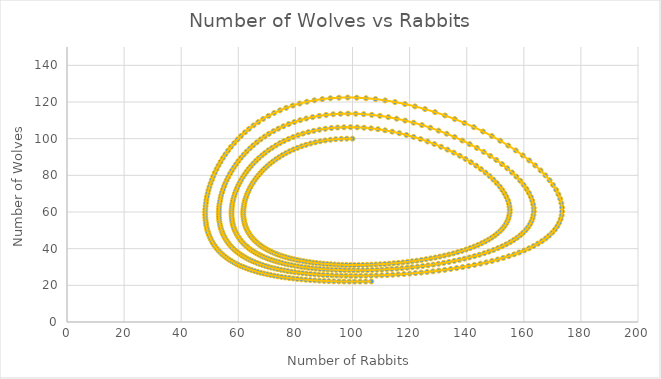
| Category | Wolves |
|---|---|
| 100.0 | 100 |
| 98.0 | 100 |
| 96.04 | 99.9 |
| 94.124002 | 99.702 |
| 92.2555371180218 | 99.409 |
| 90.43767529206256 | 99.024 |
| 88.6730401181214 | 98.551 |
| 86.96382799231598 | 97.993 |
| 85.31183072478386 | 97.354 |
| 83.71846081813496 | 96.639 |
| 82.18477864886654 | 95.852 |
| 80.71152085142708 | 94.999 |
| 79.29912927674037 | 94.082 |
| 77.94777997557912 | 93.109 |
| 76.6574117383475 | 92.082 |
| 75.42775380335446 | 91.007 |
| 74.25835242295386 | 89.889 |
| 73.14859604904728 | 88.732 |
| 72.09773896505367 | 87.541 |
| 71.10492324972356 | 86.32 |
| 70.16919900875263 | 85.072 |
| 69.28954285302093 | 83.804 |
| 68.46487463772834 | 82.517 |
| 67.69407250518984 | 81.216 |
| 66.9759862962117 | 79.904 |
| 66.30944941148343 | 78.584 |
| 65.69328921601422 | 77.261 |
| 65.12633608703902 | 75.935 |
| 64.60743120970594 | 74.611 |
| 64.13543322587716 | 73.291 |
| 63.70922384011011 | 71.977 |
| 63.3277124838488 | 70.671 |
| 62.98984013449807 | 69.375 |
| 62.69458238075251 | 68.091 |
| 62.44095181963131 | 66.821 |
| 62.22799986438927 | 65.566 |
| 62.05481803604445 | 64.328 |
| 61.9205388048498 | 63.107 |
| 61.8243360417674 | 61.906 |
| 61.76542513397156 | 60.724 |
| 61.74306281267944 | 59.563 |
| 61.75654673622716 | 58.424 |
| 61.80521486630229 | 57.307 |
| 61.88844467062012 | 56.212 |
| 62.0056521810929 | 55.141 |
| 62.15629093267786 | 54.094 |
| 62.33985080458868 | 53.07 |
| 62.55585678239594 | 52.071 |
| 62.80386765670432 | 51.096 |
| 63.08347467155351 | 50.146 |
| 63.39430013342384 | 49.22 |
| 63.73599598971024 | 48.319 |
| 64.10824238373843 | 47.443 |
| 64.51074619181045 | 46.592 |
| 64.94323954636342 | 45.765 |
| 65.40547834808412 | 44.963 |
| 65.89724076872545 | 44.185 |
| 66.4183257454012 | 43.432 |
| 66.9685514662768 | 42.702 |
| 67.54775384681308 | 41.997 |
| 68.15578499504309 | 41.316 |
| 68.7925116637582 | 40.658 |
| 69.4578136869378 | 40.023 |
| 70.1515823972693 | 39.412 |
| 70.87371902116098 | 38.824 |
| 71.62413304724657 | 38.259 |
| 72.40274056400516 | 37.716 |
| 73.20946256177461 | 37.195 |
| 74.0442231941108 | 36.697 |
| 74.90694799313776 | 36.221 |
| 75.79756203324195 | 35.766 |
| 76.7159880371844 | 35.334 |
| 77.66214441843528 | 34.922 |
| 78.6359432532773 | 34.532 |
| 79.63728817597475 | 34.163 |
| 80.66607219006521 | 33.815 |
| 81.72217538860397 | 33.489 |
| 82.80546257597396 | 33.182 |
| 83.91578078367554 | 32.897 |
| 85.05295667232957 | 32.633 |
| 86.2167938119701 | 32.389 |
| 87.4070698325772 | 32.166 |
| 88.62353343670897 | 31.963 |
| 89.86590126604781 | 31.781 |
| 91.13385461368554 | 31.62 |
| 92.42703597404842 | 31.48 |
| 93.74504542252095 | 31.361 |
| 95.08743681707946 | 31.263 |
| 96.45371381461489 | 31.186 |
| 97.84332569512561 | 31.131 |
| 99.25566298762375 | 31.097 |
| 100.6900528924441 | 31.085 |
| 102.1457544957102 | 31.096 |
| 103.6219537730256 | 31.13 |
| 105.1177583810623 | 31.186 |
| 106.6321922376559 | 31.266 |
| 108.1641898933323 | 31.369 |
| 109.7125906999401 | 31.497 |
| 111.2761327853017 | 31.65 |
| 112.8534468465857 | 31.829 |
| 114.4430497795126 | 32.033 |
| 116.0433381656031 | 32.265 |
| 117.6525816455392 | 32.524 |
| 119.2689162134118 | 32.811 |
| 120.8903374742415 | 33.127 |
| 122.5146939157734 | 33.473 |
| 124.1396802552192 | 33.85 |
| 125.7628309324166 | 34.258 |
| 127.3815138328596 | 34.699 |
| 128.992924337232 | 35.175 |
| 130.5940798084869 | 35.684 |
| 132.1818146431015 | 36.23 |
| 133.7527760298532 | 36.813 |
| 135.3034205771644 | 37.435 |
| 136.8300119885768 | 38.095 |
| 138.3286199849422 | 38.797 |
| 139.7951206911067 | 39.54 |
| 141.2251987237103 | 40.327 |
| 142.614351234616 | 41.158 |
| 143.9578941806507 | 42.035 |
| 145.2509711038521 | 42.959 |
| 146.4885647161786 | 43.931 |
| 147.6655115873675 | 44.952 |
| 148.7765202328759 | 46.024 |
| 149.8161928890005 | 47.146 |
| 150.7790512426158 | 48.32 |
| 151.659566351674 | 49.547 |
| 152.4521929478621 | 50.827 |
| 153.1514082528706 | 52.16 |
| 153.7517553630569 | 53.546 |
| 154.2478911627266 | 54.985 |
| 154.634638613148 | 56.477 |
| 154.9070431328499 | 58.02 |
| 155.0604326357519 | 59.612 |
| 155.0904806293934 | 61.254 |
| 154.9932715994594 | 62.941 |
| 154.7653677239184 | 64.671 |
| 154.4038757769179 | 66.442 |
| 153.9065129071811 | 68.25 |
| 153.2716698174773 | 70.089 |
| 152.4984697413185 | 71.956 |
| 151.5868215215384 | 73.845 |
| 150.5374650539568 | 75.75 |
| 149.3520073782483 | 77.664 |
| 148.032947786001 | 79.58 |
| 146.583690478664 | 81.491 |
| 145.0085435479035 | 83.39 |
| 143.3127033656587 | 85.266 |
| 141.5022238537565 | 87.113 |
| 139.583970541019 | 88.92 |
| 137.5655597920941 | 90.68 |
| 135.455284085311 | 92.384 |
| 133.2620247022076 | 94.021 |
| 130.9951536430934 | 95.585 |
| 128.6644269756848 | 97.066 |
| 126.2798721345607 | 98.457 |
| 123.8516718993943 | 99.751 |
| 121.39004787712 | 100.941 |
| 118.9051462919699 | 102.02 |
| 116.4069287498571 | 102.985 |
| 113.9050703994541 | 103.83 |
| 111.4088675776043 | 104.551 |
| 108.927156622565 | 105.148 |
| 106.4682450894205 | 105.617 |
| 104.0398561334581 | 105.959 |
| 101.649086364267 | 106.173 |
| 99.30237703818926 | 106.26 |
| 97.00549806803986 | 106.223 |
| 94.76354400050951 | 106.064 |
| 92.58094085195785 | 105.786 |
| 90.46146250598215 | 105.394 |
| 88.40825526016783 | 104.891 |
| 86.42386905996499 | 104.283 |
| 84.5102939669765 | 103.576 |
| 82.66900046749257 | 102.773 |
| 80.90098232432317 | 101.883 |
| 79.20680080022605 | 100.91 |
| 77.5866292244107 | 99.861 |
| 76.04029702569026 | 98.742 |
| 74.56733250917034 | 97.559 |
| 73.16700380173465 | 96.318 |
| 71.83835753035554 | 95.026 |
| 70.58025492319416 | 93.688 |
| 69.39140513460772 | 92.31 |
| 68.27039569066687 | 90.897 |
| 67.21572003158886 | 89.455 |
| 66.22580219224783 | 87.989 |
| 65.29901871273044 | 86.503 |
| 64.43371790915685 | 85.002 |
| 63.62823666223204 | 83.49 |
| 62.88091489882638 | 81.972 |
| 62.19010795186511 | 80.451 |
| 61.55419698739841 | 78.93 |
| 60.97159768626069 | 77.412 |
| 60.44076736238936 | 75.902 |
| 59.96021069168181 | 74.4 |
| 59.52848421508867 | 72.911 |
| 59.14419976818519 | 71.436 |
| 58.80602697731034 | 69.976 |
| 58.51269494997164 | 68.535 |
| 58.26299327493344 | 67.113 |
| 58.05577243550029 | 65.713 |
| 57.88994372816092 | 64.335 |
| 57.76447876809821 | 62.98 |
| 57.67840865317196 | 61.65 |
| 57.63082284888269 | 60.345 |
| 57.62086784853289 | 59.067 |
| 57.64774565530406 | 57.815 |
| 57.7107121262317 | 56.591 |
| 57.80907521204671 | 55.395 |
| 57.94219312151072 | 54.226 |
| 58.10947243415331 | 53.086 |
| 58.31036618116723 | 51.974 |
| 58.54437191058063 | 50.89 |
| 58.81102974964976 | 49.836 |
| 59.10992047465459 | 48.809 |
| 59.44066359588442 | 47.811 |
| 59.80291546352966 | 46.842 |
| 60.19636739840927 | 45.9 |
| 60.62074384992421 | 44.987 |
| 61.07580058230454 | 44.101 |
| 61.56132288908043 | 43.243 |
| 62.0771238347306 | 42.412 |
| 62.62304252162058 | 41.607 |
| 63.19894237961878 | 40.83 |
| 63.80470947515032 | 40.079 |
| 64.4402508359023 | 39.353 |
| 65.10549278691481 | 38.654 |
| 65.8003792933665 | 37.979 |
| 66.52487030498237 | 37.33 |
| 67.27894009664362 | 36.705 |
| 68.06257559945769 | 36.104 |
| 68.87577471624326 | 35.528 |
| 69.71854461509422 | 34.975 |
| 70.59089999440236 | 34.445 |
| 71.49286131243751 | 33.939 |
| 72.42445297430018 | 33.455 |
| 73.38570146877558 | 32.994 |
| 74.3766334473218 | 32.555 |
| 75.39727373712226 | 32.138 |
| 76.44764327981795 | 31.742 |
| 77.5277569872089 | 31.369 |
| 78.63762150487733 | 31.016 |
| 79.777232874336 | 30.685 |
| 80.94657408394617 | 30.375 |
| 82.14561249848232 | 30.085 |
| 83.37429715684667 | 29.817 |
| 84.6325559270615 | 29.569 |
| 85.92029250729303 | 29.342 |
| 87.23738326129492 | 29.135 |
| 88.58367387630997 | 28.949 |
| 89.95897583114113 | 28.784 |
| 91.3630626618133 | 28.639 |
| 92.79566601200273 | 28.516 |
| 94.25647145523163 | 28.413 |
| 95.74511407572707 | 28.331 |
| 97.26117379484783 | 28.271 |
| 98.80417043011678 | 28.232 |
| 100.3735584741879 | 28.215 |
| 101.9687215815617 | 28.221 |
| 103.5889667515808 | 28.249 |
| 105.2335181972325 | 28.299 |
| 106.9015108906176 | 28.373 |
| 108.5919837776615 | 28.471 |
| 110.3038726568329 | 28.593 |
| 112.0360027193565 | 28.741 |
| 113.7870807517605 | 28.914 |
| 115.555687005682 | 29.113 |
| 117.3402667447685 | 29.34 |
| 119.1391214843932 | 29.594 |
| 120.9503999468659 | 29.877 |
| 122.7720887630233 | 30.19 |
| 124.6020029606677 | 30.534 |
| 126.4377762914544 | 30.909 |
| 128.2768514606737 | 31.318 |
| 130.116470339091 | 31.761 |
| 131.9536642527702 | 32.239 |
| 133.7852444657489 | 32.754 |
| 135.6077929916921 | 33.307 |
| 137.4176538943101 | 33.9 |
| 139.2109252624306 | 34.535 |
| 140.983452074126 | 35.212 |
| 142.7308201950968 | 35.933 |
| 144.4483517893528 | 36.701 |
| 146.1311024547111 | 37.517 |
| 147.773860431163 | 38.382 |
| 149.3711482659266 | 39.299 |
| 150.9172273539185 | 40.269 |
| 152.4061058050376 | 41.294 |
| 153.8315501183211 | 42.376 |
| 155.1871011655521 | 43.517 |
| 156.46609500075 | 44.718 |
| 157.6616890141816 | 45.98 |
| 158.7668939367758 | 47.306 |
| 159.7746121694013 | 48.696 |
| 160.6776828575051 | 50.151 |
| 161.4689340510947 | 51.673 |
| 162.1412421791752 | 53.261 |
| 162.6875989231196 | 54.916 |
| 163.1011853924896 | 56.637 |
| 163.3754532882032 | 58.424 |
| 163.5042124820897 | 60.275 |
| 163.4817241514814 | 62.189 |
| 163.3027982880488 | 64.163 |
| 162.9628940603462 | 66.194 |
| 162.458221161799 | 68.278 |
| 161.785839936132 | 70.41 |
| 160.9437577599631 | 72.585 |
| 159.9310188998428 | 74.797 |
| 158.7477848726213 | 77.038 |
| 157.39540224827 | 79.301 |
| 155.8764548662033 | 81.577 |
| 154.1947976089083 | 83.856 |
| 152.3555692031632 | 86.128 |
| 150.3651820035099 | 88.383 |
| 148.2312873484413 | 90.609 |
| 145.9627158485324 | 92.794 |
| 143.5693928367696 | 94.926 |
| 141.0622301426571 | 96.994 |
| 138.4529962923169 | 98.985 |
| 135.7541681303846 | 100.889 |
| 132.9787676487527 | 102.692 |
| 130.1401884390831 | 104.386 |
| 127.2520166166822 | 105.959 |
| 124.3278512626092 | 107.402 |
| 121.3811293853087 | 108.709 |
| 118.4249601172949 | 109.871 |
| 115.4719723588318 | 110.883 |
| 112.5341793968362 | 111.741 |
| 109.6228632126166 | 112.441 |
| 106.7484803023754 | 112.982 |
| 103.9205899269217 | 113.364 |
| 101.1478048354588 | 113.586 |
| 98.43776371857695 | 113.651 |
| 95.79712397301923 | 113.562 |
| 93.23157282843327 | 113.324 |
| 90.74585450485012 | 112.94 |
| 88.34381083826867 | 112.417 |
| 86.028432720189 | 111.762 |
| 83.80191972782495 | 110.982 |
| 81.66574545309646 | 110.083 |
| 79.62072624635364 | 109.074 |
| 77.66709135117378 | 107.962 |
| 75.80455269727845 | 106.757 |
| 74.03237292028334 | 105.465 |
| 72.34943047377614 | 104.096 |
| 70.7542809790106 | 102.657 |
| 69.24521421181664 | 101.155 |
| 67.82030634993718 | 99.6 |
| 66.47746729445659 | 97.997 |
| 65.21448303604726 | 96.355 |
| 64.02905316184741 | 94.679 |
| 62.91882369445931 | 92.976 |
| 61.88141552408661 | 91.252 |
| 60.91444874181527 | 89.513 |
| 60.01556321014752 | 87.764 |
| 59.18243571964444 | 86.009 |
| 58.41279408116293 | 84.254 |
| 57.70442849457676 | 82.502 |
| 57.05520051954487 | 80.757 |
| 56.46304995393341 | 79.023 |
| 55.9259999026328 | 77.303 |
| 55.44216029511217 | 75.599 |
| 55.0097300851888 | 73.915 |
| 54.62699834196375 | 72.252 |
| 54.29234441726717 | 70.613 |
| 54.00423735266774 | 68.999 |
| 53.76123466838398 | 67.413 |
| 53.56198065742778 | 65.854 |
| 53.40520429106542 | 64.325 |
| 53.2897168261839 | 62.826 |
| 53.21440919134152 | 61.359 |
| 53.17824921606922 | 59.924 |
| 53.18027875726263 | 58.521 |
| 53.2196107671428 | 57.151 |
| 53.29542633913813 | 55.814 |
| 53.40697176102876 | 54.511 |
| 53.55355559867361 | 53.241 |
| 53.73454582849757 | 52.004 |
| 53.94936703254367 | 50.801 |
| 54.19749766619567 | 49.632 |
| 54.47846740556134 | 48.495 |
| 54.79185457889613 | 47.391 |
| 55.13728368426913 | 46.32 |
| 55.5144229938659 | 45.281 |
| 55.92298224382913 | 44.274 |
| 56.36271040731061 | 43.298 |
| 56.83339354740206 | 42.353 |
| 57.33485274579393 | 41.439 |
| 57.86694210234421 | 40.555 |
| 58.42954680019966 | 39.701 |
| 59.02258123067316 | 38.876 |
| 59.64598717172358 | 38.079 |
| 60.2997320135907 | 37.311 |
| 60.9838070248925 | 36.57 |
| 61.69822565228174 | 35.857 |
| 62.44302184657327 | 35.17 |
| 63.21824840808207 | 34.51 |
| 64.02397534374789 | 33.875 |
| 64.8602882284568 | 33.266 |
| 65.72728656279875 | 32.681 |
| 66.62508211931682 | 32.121 |
| 67.55379726910385 | 31.585 |
| 68.5135632803831 | 31.073 |
| 69.50451858046483 | 30.584 |
| 70.52680697220188 | 30.117 |
| 71.58057579576673 | 29.673 |
| 72.66597402624247 | 29.252 |
| 73.78315029715496 | 28.852 |
| 74.93225083967471 | 28.474 |
| 76.11341732678034 | 28.117 |
| 77.32678461120318 | 27.781 |
| 78.5724783454608 | 27.466 |
| 79.85061247173866 | 27.172 |
| 81.16128656879253 | 26.898 |
| 82.50458304242125 | 26.645 |
| 83.88056414540182 | 26.412 |
| 85.28926881208972 | 26.199 |
| 86.73070929216934 | 26.006 |
| 88.2048675673 | 25.834 |
| 89.71169153364634 | 25.681 |
| 91.25109093251925 | 25.549 |
| 92.82293301059369 | 25.437 |
| 94.42703789042942 | 25.346 |
| 96.06317363131323 | 25.275 |
| 97.7310509597923 | 25.226 |
| 99.43031764869895 | 25.197 |
| 101.1605525230132 | 25.19 |
| 102.9212590706026 | 25.204 |
| 104.7118586357715 | 25.241 |
| 106.5316831736878 | 25.301 |
| 108.3799675442089 | 25.383 |
| 110.2558413244637 | 25.49 |
| 112.1583201208585 | 25.62 |
| 114.0862963630651 | 25.776 |
| 116.0385295651301 | 25.958 |
| 118.0136360422624 | 26.166 |
| 120.0100780762657 | 26.402 |
| 122.0261525281637 | 26.666 |
| 124.0599789035244 | 26.959 |
| 126.1094868845637 | 27.284 |
| 128.1724033535448 | 27.64 |
| 130.2462389445876 | 28.029 |
| 132.3282741760641 | 28.453 |
| 134.4155452336303 | 28.913 |
| 136.5048294949819 | 29.411 |
| 138.5926309119965 | 29.947 |
| 140.6751653944183 | 30.525 |
| 142.7483463720111 | 31.146 |
| 144.8077707494891 | 31.812 |
| 146.8487055108091 | 32.525 |
| 148.8660752767499 | 33.286 |
| 150.8544511721724 | 34.1 |
| 152.8080414167858 | 34.967 |
| 154.7206841152643 | 35.89 |
| 156.5858427884046 | 36.872 |
| 158.3966052555452 | 37.915 |
| 160.1456865479905 | 39.022 |
| 161.8254366013764 | 40.196 |
| 163.4278535387065 | 41.438 |
| 164.9446034112745 | 42.752 |
| 166.3670473069758 | 44.141 |
| 167.6862767587628 | 45.605 |
| 168.8931583833 | 47.149 |
| 169.9783886434391 | 48.773 |
| 170.9325595493444 | 50.48 |
| 171.7462359829347 | 52.27 |
| 172.4100451397556 | 54.145 |
| 172.9147783231383 | 56.105 |
| 173.2515049908504 | 58.151 |
| 173.4116985403741 | 60.281 |
| 173.387372825447 | 62.493 |
| 173.171227828923 | 64.786 |
| 172.7568022875043 | 67.157 |
| 172.1386303926269 | 69.6 |
| 171.3123990078135 | 72.11 |
| 170.2751011842953 | 74.681 |
| 169.0251811702543 | 77.305 |
| 167.5626656478562 | 79.973 |
| 165.88927565298 | 82.675 |
| 164.0085135908263 | 85.399 |
| 161.9257200052663 | 88.132 |
| 159.6480953265536 | 90.861 |
| 157.1846827267568 | 93.57 |
| 154.5463094453289 | 96.246 |
| 151.7454854694244 | 98.871 |
| 148.7962601950001 | 101.429 |
| 145.7140395571486 | 103.903 |
| 142.5153679812092 | 106.278 |
| 139.2176812375382 | 108.538 |
| 135.8390377505203 | 110.666 |
| 132.3978369990605 | 112.649 |
| 128.9125342617769 | 114.474 |
| 125.4013610542172 | 116.129 |
| 121.8820601711696 | 117.604 |
| 118.3716433237805 | 118.89 |
| 114.8861780290014 | 119.982 |
| 111.4406087796834 | 120.875 |
| 108.0486157278674 | 121.567 |
| 104.722512286198 | 122.056 |
| 101.4731813182714 | 122.344 |
| 98.3100480527851 | 122.434 |
| 95.2410865950328 | 122.331 |
| 92.27285596731762 | 122.04 |
| 89.41056100085467 | 121.568 |
| 86.65813311199848 | 120.925 |
| 84.01832599015707 | 120.118 |
| 81.4928214543042 | 119.158 |
| 79.08234114313804 | 118.055 |
| 76.78676023325025 | 116.821 |
| 74.60521997667622 | 115.465 |
| 72.53623646767556 | 113.999 |
| 70.5778036514403 | 112.433 |
| 68.72748914721846 | 110.779 |
| 66.98252195688275 | 109.047 |
| 65.33987155720673 | 107.247 |
| 63.7963182266519 | 105.388 |
| 62.34851473700862 | 103.481 |
| 60.99303975204235 | 101.532 |
| 59.72644342685902 | 99.552 |
| 58.54528580163682 | 97.548 |
| 57.44616864056633 | 95.526 |
| 56.42576138986087 | 93.493 |
| 55.48082192538304 | 91.456 |
| 54.60821273767453 | 89.42 |
| 53.80491316582845 | 87.391 |
| 53.06802824652017 | 85.372 |
| 52.39479469445815 | 83.369 |
| 51.78258447849735 | 81.385 |
| 51.22890640589222 | 79.423 |
| 50.73140607723521 | 77.486 |
| 50.28786452760254 | 75.577 |
| 49.89619582597331 | 73.699 |
| 49.55444386545053 | 71.852 |
| 49.2607785413089 | 70.04 |
| 49.01349148237031 | 68.263 |
| 48.81099147349282 | 66.523 |
| 48.65179968280852 | 64.82 |
| 48.53454478646763 | 63.156 |
| 48.45795806573364 | 61.531 |
| 48.42086853601142 | 59.945 |
| 48.42219815447317 | 58.399 |
| 48.46095714208721 | 56.893 |
| 48.53623944678368 | 55.427 |
| 48.64721836696629 | 54.001 |
| 48.7931423483787 | 52.614 |
| 48.97333096226529 | 51.267 |
| 49.18717106865277 | 49.959 |
| 49.43411316527574 | 48.69 |
| 49.7136679200379 | 47.459 |
| 50.0254028828358 | 46.266 |
| 50.36893937097066 | 45.109 |
| 50.7439495211553 | 43.99 |
| 51.15015350021843 | 42.907 |
| 51.58731686595463 | 41.859 |
| 52.05524806911733 | 40.845 |
| 52.55379608726096 | 39.866 |
| 53.08284818097144 | 38.921 |
| 53.64232776295138 | 38.007 |
| 54.23219237042458 | 37.127 |
| 54.85243173137101 | 36.277 |
| 55.50306591518326 | 35.458 |
| 56.18414355843335 | 34.669 |
| 56.89574015654341 | 33.91 |
| 57.63795641225572 | 33.179 |
| 58.41091663188822 | 32.476 |
| 59.2147671604353 | 31.801 |
| 60.0496748466237 | 31.152 |
| 60.9158255290559 | 30.53 |
| 61.81342253456397 | 29.933 |
| 62.74268517985216 | 29.362 |
| 63.70384726742337 | 28.815 |
| 64.69715556666021 | 28.292 |
| 65.72286827076336 | 27.792 |
| 66.78125342003516 | 27.316 |
| 67.87258728173359 | 26.862 |
| 68.99715267640715 | 26.431 |
| 70.15523724025384 | 26.021 |
| 71.34713161262364 | 25.633 |
| 72.57312753730257 | 25.266 |
| 73.83351586567348 | 24.919 |
| 75.1285844492434 | 24.593 |
| 76.45861590835578 | 24.287 |
| 77.8238852631666 | 24.001 |
| 79.22465741215306 | 23.735 |
| 80.66118444254164 | 23.489 |
| 82.1337027560848 | 23.262 |
| 83.64242999258317 | 23.054 |
| 85.18756173244043 | 22.865 |
| 86.76926795835166 | 22.696 |
| 88.3876892549643 | 22.546 |
| 90.04293272401475 | 22.415 |
| 91.73506759103927 | 22.303 |
| 93.46412047828944 | 22.211 |
| 95.23007031696031 | 22.139 |
| 97.03284287027503 | 22.086 |
| 98.87230483738068 | 22.053 |
| 100.7482575064162 | 22.041 |
| 102.6604299235446 | 22.049 |
| 104.6084715432327 | 22.078 |
| 106.5919443236544 | 22.129 |